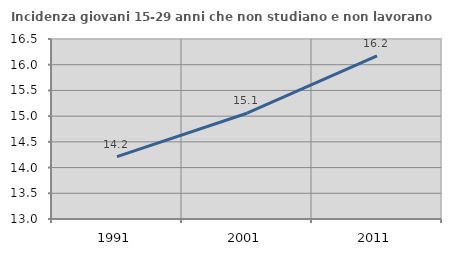
| Category | Incidenza giovani 15-29 anni che non studiano e non lavorano  |
|---|---|
| 1991.0 | 14.212 |
| 2001.0 | 15.057 |
| 2011.0 | 16.17 |